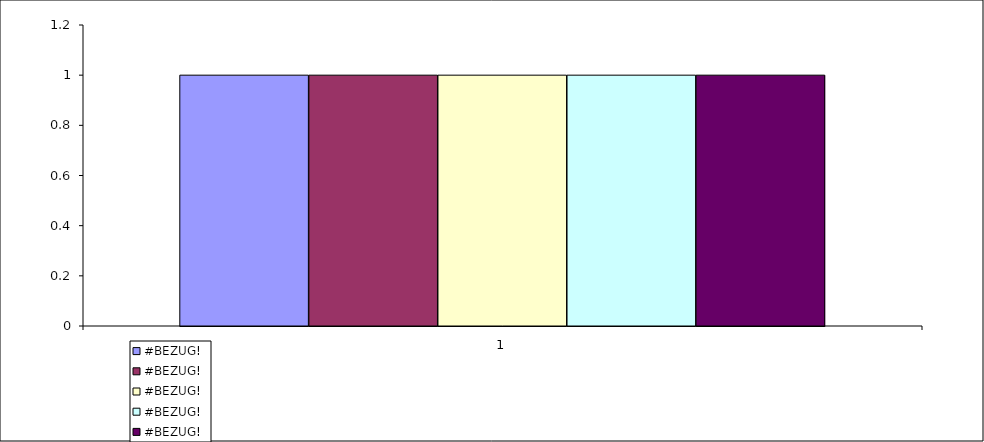
| Category | #BEZUG! |
|---|---|
| 1.0 | 1 |